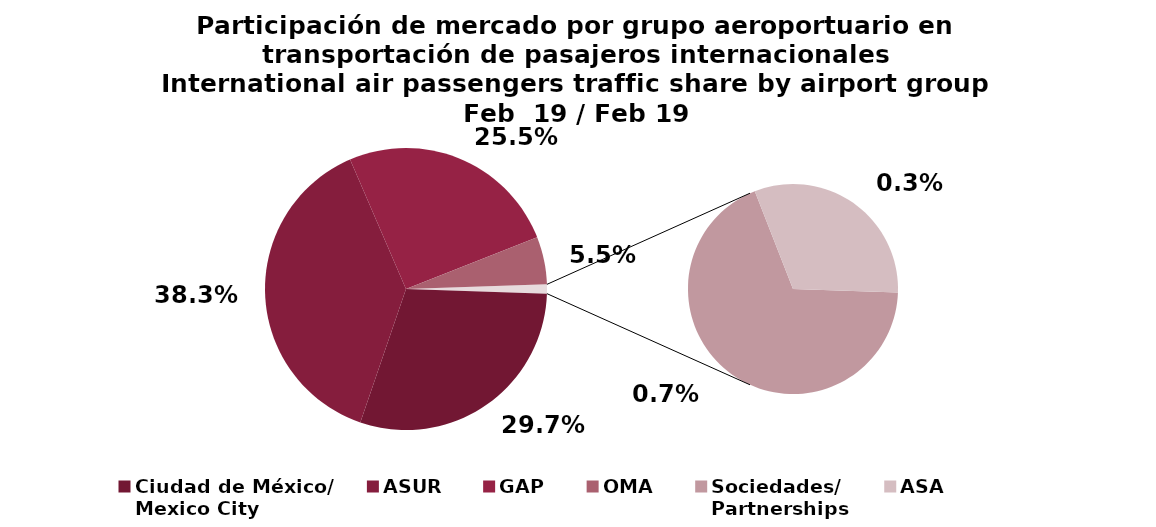
| Category | Series 0 |
|---|---|
| Ciudad de México/
Mexico City | 1220.756 |
| ASUR | 1570.956 |
| GAP | 1047.264 |
| OMA | 224.302 |
| Sociedades/
Partnerships | 29.438 |
| ASA | 13.506 |